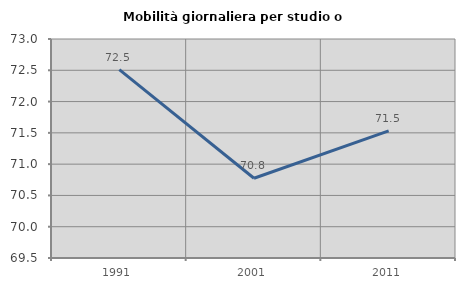
| Category | Mobilità giornaliera per studio o lavoro |
|---|---|
| 1991.0 | 72.511 |
| 2001.0 | 70.775 |
| 2011.0 | 71.53 |